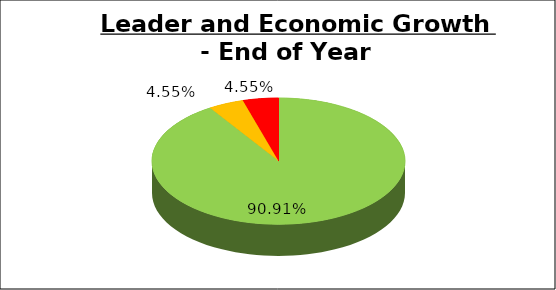
| Category | Q4 |
|---|---|
| Green | 0.909 |
| Amber | 0.045 |
| Red | 0.045 |